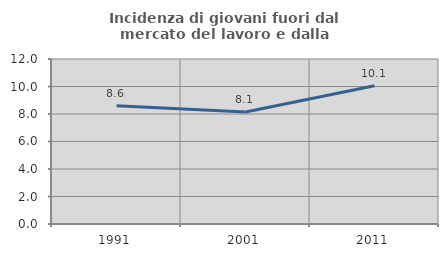
| Category | Incidenza di giovani fuori dal mercato del lavoro e dalla formazione  |
|---|---|
| 1991.0 | 8.602 |
| 2001.0 | 8.143 |
| 2011.0 | 10.055 |